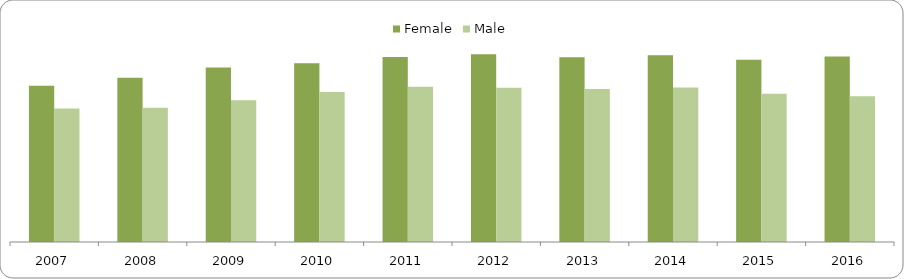
| Category | Female | Male |
|---|---|---|
| 2007 | 4643 | 3969 |
| 2008 | 4878 | 3990 |
| 2009 | 5184 | 4207 |
| 2010 | 5313 | 4459 |
| 2011 | 5492 | 4611 |
| 2012 | 5579 | 4580 |
| 2013 | 5489 | 4547 |
| 2014 | 5547 | 4588 |
| 2015 | 5411 | 4404 |
| 2016 | 5511 | 4332 |